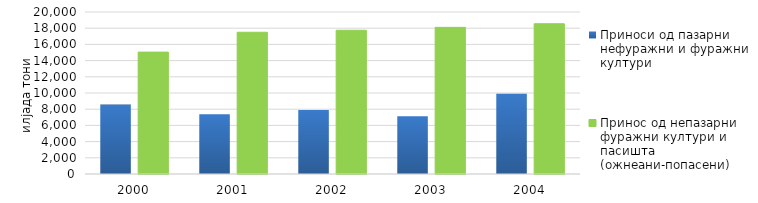
| Category | Приноси од пазарни нефуражни и фуражни култури | Принос од непазарни фуражни култури и пасишта (ожнеани-попасени) |
|---|---|---|
| 2000.0 | 8571 | 15050 |
| 2001.0 | 7381 | 17498 |
| 2002.0 | 7894 | 17745 |
| 2003.0 | 7124 | 18103 |
| 2004.0 | 9916 | 18551 |